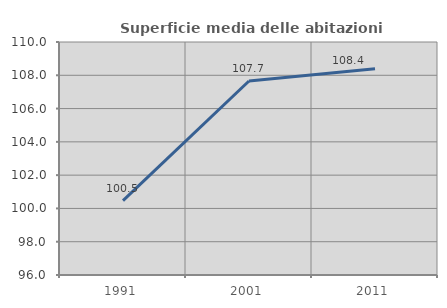
| Category | Superficie media delle abitazioni occupate |
|---|---|
| 1991.0 | 100.47 |
| 2001.0 | 107.655 |
| 2011.0 | 108.389 |